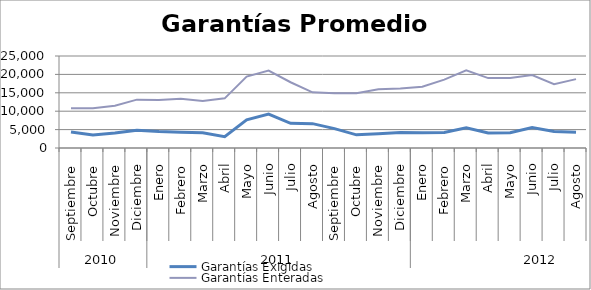
| Category | Garantías Exigidas | Garantías Enteradas |
|---|---|---|
| 0 | 4372.607 | 10829.062 |
| 1 | 3557.93 | 10787.9 |
| 2 | 4056.528 | 11463.422 |
| 3 | 4832.111 | 13142.881 |
| 4 | 4466.32 | 13061.162 |
| 5 | 4313.718 | 13357.444 |
| 6 | 4162.491 | 12796.251 |
| 7 | 3090.395 | 13495.263 |
| 8 | 7655.186 | 19416.342 |
| 9 | 9198.096 | 21035.301 |
| 10 | 6699.851 | 17866.843 |
| 11 | 6615.292 | 15119.839 |
| 12 | 5266.973 | 14911.639 |
| 13 | 3572.137 | 14861.465 |
| 14 | 3876.388 | 15976.819 |
| 15 | 4182.413 | 16147.351 |
| 16 | 4146.8 | 16662.483 |
| 17 | 4190.531 | 18572.749 |
| 18 | 5482.211 | 21128.648 |
| 19 | 4079.038 | 18997.51 |
| 20 | 4141.554 | 19005.364 |
| 21 | 5549.139 | 19818.91 |
| 22 | 4487.023 | 17351.39 |
| 23 | 4277.924 | 18719.955 |